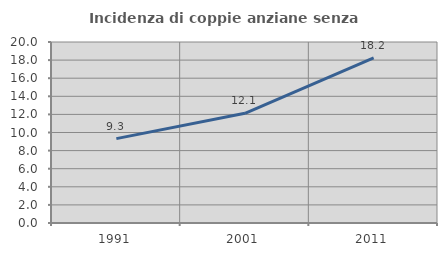
| Category | Incidenza di coppie anziane senza figli  |
|---|---|
| 1991.0 | 9.322 |
| 2001.0 | 12.121 |
| 2011.0 | 18.248 |